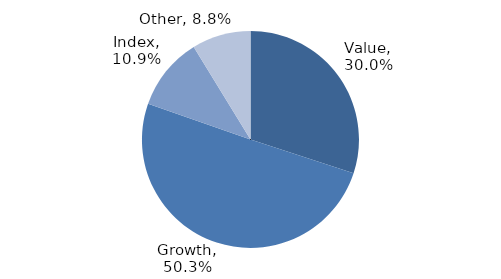
| Category | Investment Style |
|---|---|
| Value | 0.3 |
| Growth | 0.503 |
| Index | 0.109 |
| Other | 0.088 |